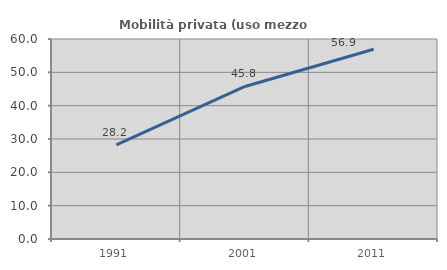
| Category | Mobilità privata (uso mezzo privato) |
|---|---|
| 1991.0 | 28.24 |
| 2001.0 | 45.76 |
| 2011.0 | 56.942 |